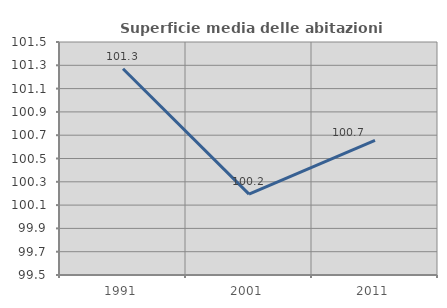
| Category | Superficie media delle abitazioni occupate |
|---|---|
| 1991.0 | 101.27 |
| 2001.0 | 100.194 |
| 2011.0 | 100.655 |